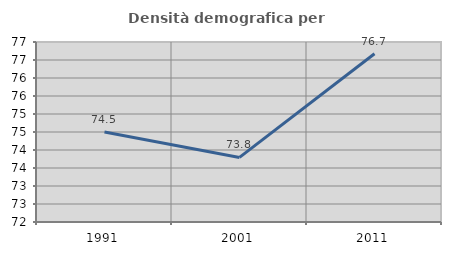
| Category | Densità demografica |
|---|---|
| 1991.0 | 74.5 |
| 2001.0 | 73.794 |
| 2011.0 | 76.672 |